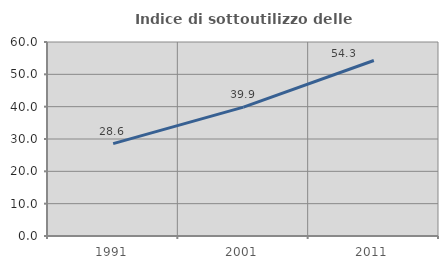
| Category | Indice di sottoutilizzo delle abitazioni  |
|---|---|
| 1991.0 | 28.587 |
| 2001.0 | 39.858 |
| 2011.0 | 54.274 |